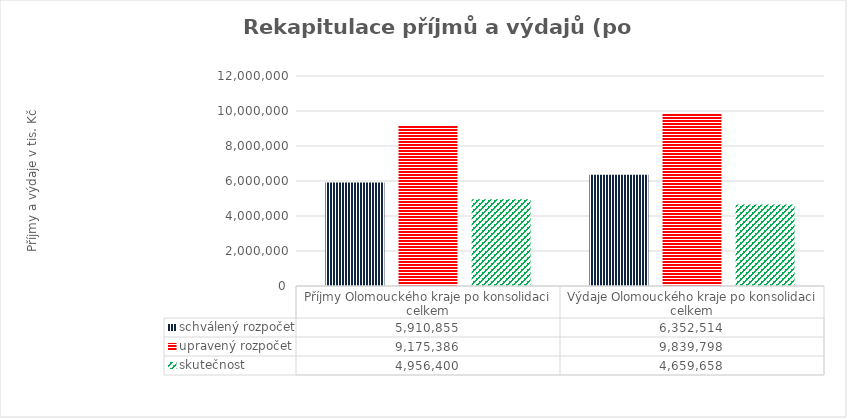
| Category | schválený rozpočet | upravený rozpočet | skutečnost |
|---|---|---|---|
| Příjmy Olomouckého kraje po konsolidaci celkem | 5910855 | 9175386 | 4956400 |
| Výdaje Olomouckého kraje po konsolidaci celkem | 6352514 | 9839798 | 4659658 |